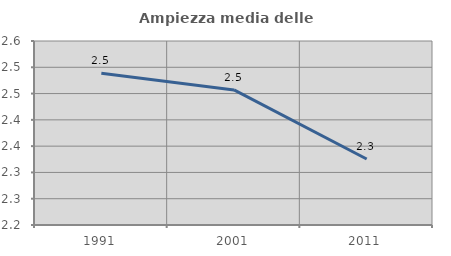
| Category | Ampiezza media delle famiglie |
|---|---|
| 1991.0 | 2.489 |
| 2001.0 | 2.457 |
| 2011.0 | 2.326 |